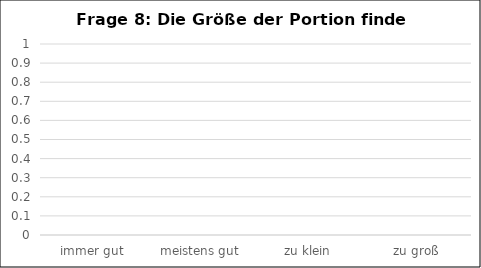
| Category | Series 0 |
|---|---|
| immer gut | 0 |
| meistens gut | 0 |
| zu klein | 0 |
| zu groß | 0 |